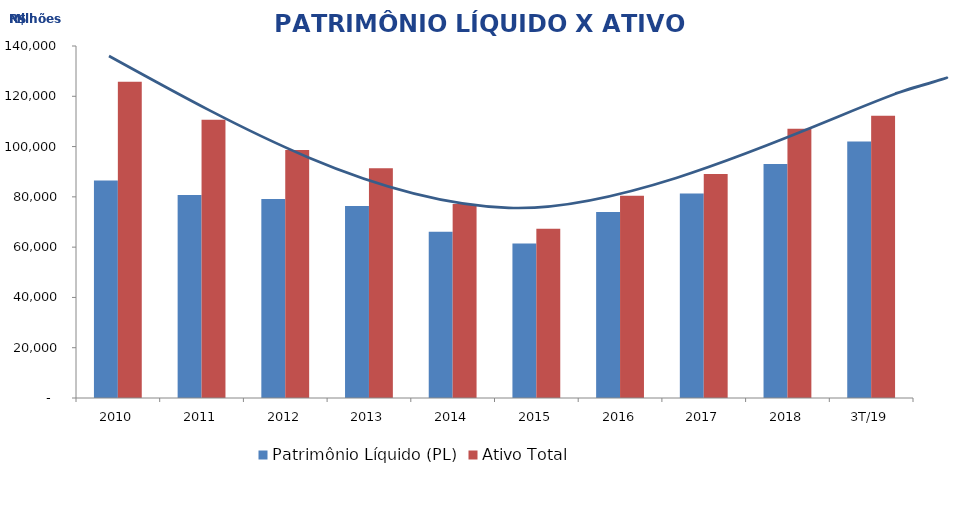
| Category | Patrimônio Líquido (PL) | Ativo Total |
|---|---|---|
| 2010 | 86501.946 | 125823.422 |
| 2011 | 80770.64 | 110658.283 |
| 2012 | 79154.143 | 98642.314 |
| 2013 | 76353 | 91331.207 |
| 2014 | 66109.273 | 77169.188 |
| 2015 | 61433.25 | 67328.198 |
| 2016 | 74006.012 | 80399.223 |
| 2017 | 81330.128 | 89114.324 |
| 2018 | 93046.003 | 107064.891 |
| 3T/19 | 102005.177 | 112226.415 |